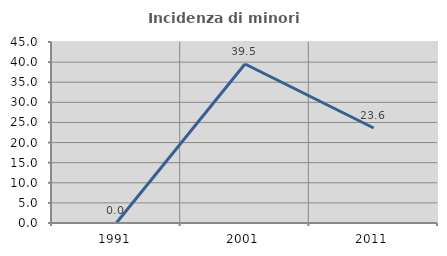
| Category | Incidenza di minori stranieri |
|---|---|
| 1991.0 | 0 |
| 2001.0 | 39.535 |
| 2011.0 | 23.611 |